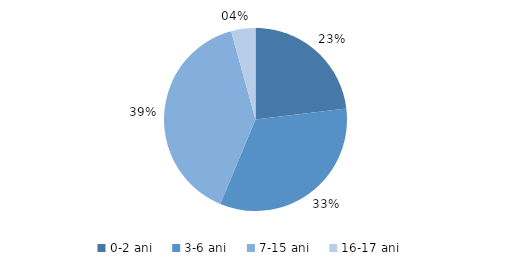
| Category | Series 0 |
|---|---|
| 0-2 ani | 23.1 |
| 3-6 ani | 33.2 |
| 7-15 ani | 39.4 |
| 16-17 ani | 4.3 |